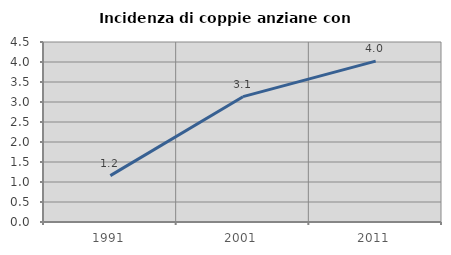
| Category | Incidenza di coppie anziane con figli |
|---|---|
| 1991.0 | 1.16 |
| 2001.0 | 3.133 |
| 2011.0 | 4.021 |